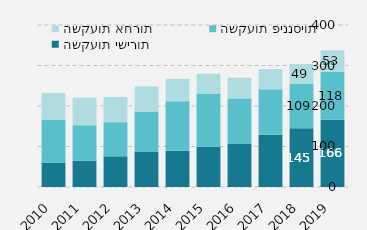
| Category | השקעות ישירות | השקעות פיננסיות | השקעות אחרות |
|---|---|---|---|
| 0 | 60086.324 | 105113.94 | 67066.076 |
| 1 | 64841.884 | 87739.351 | 67903.259 |
| 2 | 75804.784 | 84167.444 | 62443.862 |
| 3 | 86531 | 99799.022 | 62166.761 |
| 4 | 89619.734 | 122339.712 | 55093.601 |
| 5 | 99312.693 | 131424.704 | 48957.737 |
| 6 | 107482.834 | 110894.583 | 51422.544 |
| 7 | 129142.817 | 112188.247 | 49688.684 |
| 8 | 145344.892 | 108951 | 49339 |
| 9 | 166229 | 118157 | 52909 |